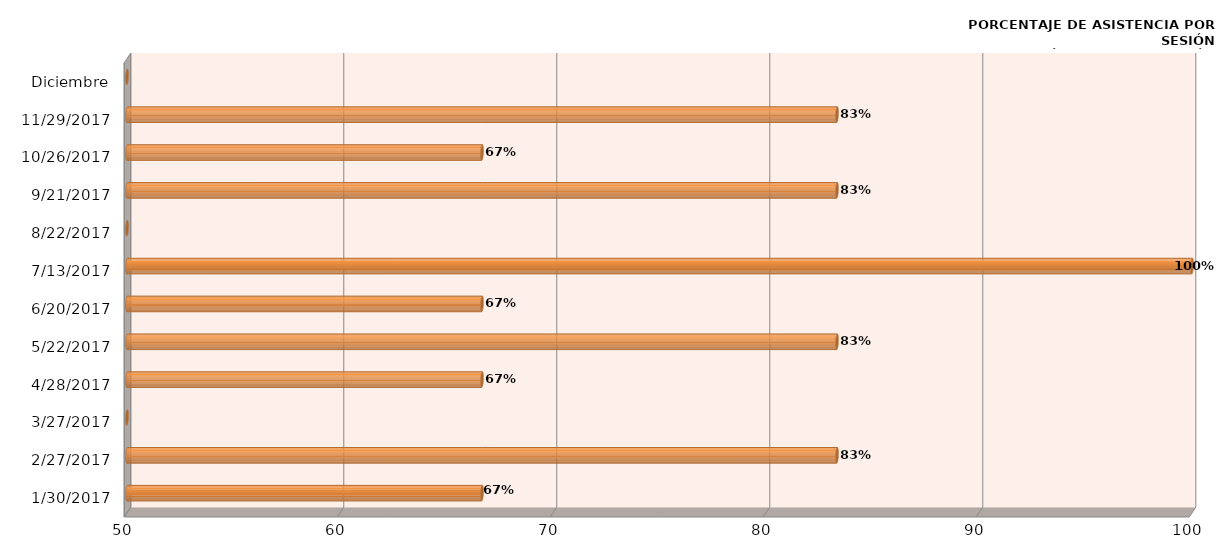
| Category | Series 0 |
|---|---|
| 30/01/2017 | 66.667 |
| 27/02/2017 | 83.333 |
| 27/03/2017 | 0 |
| 28/04/2017 | 66.667 |
| 22/05/2017 | 83.333 |
| 20/06/2017 | 66.667 |
| 13/07/2017 | 100 |
| 22/08/2017 | 0 |
| 21/09/2017 | 83.333 |
| 26/10/2017 | 66.667 |
| 29/11/2017 | 83.333 |
| Diciembre | 0 |